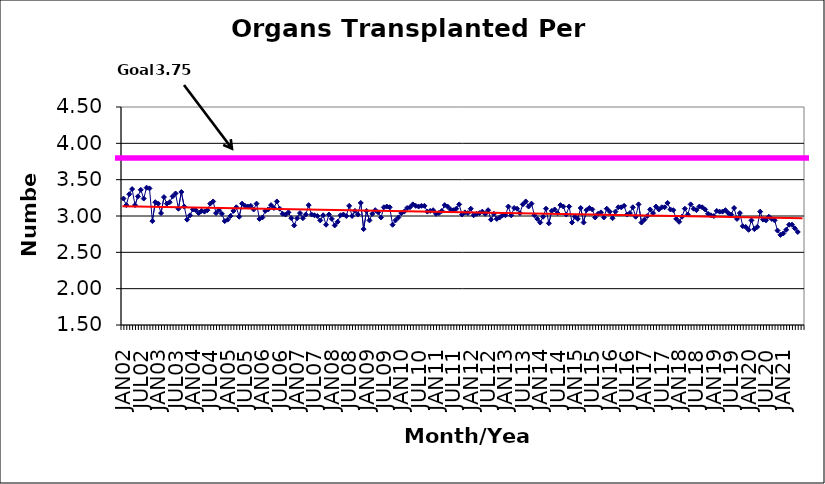
| Category | Series 0 |
|---|---|
| JAN02 | 3.24 |
| FEB02 | 3.15 |
| MAR02 | 3.3 |
| APR02 | 3.37 |
| MAY02 | 3.15 |
| JUN02 | 3.27 |
| JUL02 | 3.36 |
| AUG02 | 3.24 |
| SEP02 | 3.39 |
| OCT02 | 3.38 |
| NOV02 | 2.93 |
| DEC02 | 3.19 |
| JAN03 | 3.17 |
| FEB03 | 3.04 |
| MAR03 | 3.26 |
| APR03 | 3.17 |
| MAY03 | 3.19 |
| JUN03 | 3.27 |
| JUL03 | 3.31 |
| AUG03 | 3.1 |
| SEP03 | 3.33 |
| OCT03 | 3.13 |
| NOV03 | 2.95 |
| DEC03 | 3.01 |
| JAN04 | 3.09 |
| FEB04 | 3.08 |
| MAR04 | 3.04 |
| APR04 | 3.07 |
| MAY04 | 3.06 |
| JUN04 | 3.08 |
| JUL04 | 3.17 |
| AUG04 | 3.2 |
| SEP04 | 3.04 |
| OCT04 | 3.08 |
| NOV04 | 3.03 |
| DEC04 | 2.93 |
| JAN05 | 2.95 |
| FEB05 | 3 |
| MAR05 | 3.07 |
| APR05 | 3.12 |
| MAY05 | 2.99 |
| JUN05 | 3.17 |
| JUL05 | 3.14 |
| AUG05 | 3.13 |
| SEP05 | 3.14 |
| OCT05 | 3.09 |
| NOV05 | 3.17 |
| DEC05 | 2.96 |
| JAN06 | 2.98 |
| FEB06 | 3.07 |
| MAR06 | 3.09 |
| APR06 | 3.15 |
| MAY06 | 3.11 |
| JUN06 | 3.2 |
| JUL06 | 3.1 |
| AUG06 | 3.03 |
| SEP06 | 3.02 |
| OCT06 | 3.05 |
| NOV06 | 2.97 |
| DEC06 | 2.87 |
| JAN07 | 2.97 |
| FEB07 | 3.04 |
| MAR07 | 2.97 |
| APR07 | 3.02 |
| MAY07 | 3.15 |
| JUN07 | 3.02 |
| JUL07 | 3.01 |
| AUG07 | 3 |
| SEP07 | 2.94 |
| OCT07 | 3.01 |
| NOV07 | 2.88 |
| DEC07 | 3.02 |
| JAN08 | 2.96 |
| FEB08 | 2.87 |
| MAR08 | 2.92 |
| APR08 | 3.01 |
| MAY08 | 3.02 |
| JUN08 | 3 |
| JUL08 | 3.14 |
| AUG08 | 3 |
| SEP08 | 3.07 |
| OCT08 | 3.02 |
| NOV08 | 3.18 |
| DEC08 | 2.82 |
| JAN09 | 3.07 |
| FEB09 | 2.94 |
| MAR09 | 3.03 |
| APR09 | 3.08 |
| MAY09 | 3.05 |
| JUN09 | 2.98 |
| JUL09 | 3.12 |
| AUG09 | 3.13 |
| SEP09 | 3.12 |
| OCT09 | 2.88 |
| NOV09 | 2.94 |
| DEC09 | 2.98 |
| JAN10 | 3.04 |
| FEB10 | 3.06 |
| MAR10 | 3.11 |
| APR10 | 3.12 |
| MAY10 | 3.16 |
| JUN10 | 3.14 |
| JUL10 | 3.13 |
| AUG10 | 3.14 |
| SEP10 | 3.14 |
| OCT10 | 3.06 |
| NOV10 | 3.07 |
| DEC10 | 3.08 |
| JAN11 | 3.03 |
| FEB11 | 3.04 |
| MAR11 | 3.07 |
| APR11 | 3.15 |
| MAY11 | 3.13 |
| JUN11 | 3.09 |
| JUL11 | 3.08 |
| AUG11 | 3.1 |
| SEP11 | 3.16 |
| OCT11 | 3.02 |
| NOV11 | 3.05 |
| DEC11 | 3.04 |
| JAN12 | 3.1 |
| FEB12 | 3.01 |
| MAR12 | 3.03 |
| APR12 | 3.04 |
| MAY12 | 3.06 |
| JUN12 | 3.03 |
| JUL12 | 3.08 |
| AUG12 | 2.95 |
| SEP12 | 3.03 |
| OCT12 | 2.96 |
| NOV12 | 2.98 |
| DEC12 | 3.01 |
| JAN13 | 3.01 |
| FEB13 | 3.13 |
| MAR13 | 3.01 |
| APR13 | 3.11 |
| MAY13 | 3.1 |
| JUN13 | 3.04 |
| JUL13 | 3.16 |
| AUG13 | 3.2 |
| SEP13 | 3.13 |
| OCT13 | 3.17 |
| NOV13 | 3.01 |
| DEC13 | 2.96 |
| JAN14 | 2.91 |
| FEB14 | 2.99 |
| MAR14 | 3.1 |
| APR14 | 2.9 |
| MAY14 | 3.07 |
| JUN14 | 3.09 |
| JUL14 | 3.04 |
| AUG14 | 3.15 |
| SEP14 | 3.13 |
| OCT14 | 3.02 |
| NOV14 | 3.13 |
| DEC14 | 2.91 |
| JAN15 | 2.99 |
| FEB15 | 2.96 |
| MAR15 | 3.11 |
| APR15 | 2.91 |
| MAY15 | 3.08 |
| JUN15 | 3.11 |
| JUL15 | 3.09 |
| AUG15 | 2.98 |
| SEP15 | 3.03 |
| OCT15 | 3.05 |
| NOV15 | 2.98 |
| DEC15 | 3.1 |
| JAN16 | 3.06 |
| FEB16 | 2.97 |
| MAR16 | 3.06 |
| APR16 | 3.12 |
| MAY16 | 3.12 |
| JUN16 | 3.14 |
| JUL16 | 3.02 |
| AUG16 | 3.04 |
| SEP16 | 3.12 |
| OCT16 | 2.99 |
| NOV16 | 3.16 |
| DEC16 | 2.91 |
| JAN17 | 2.95 |
| FEB17 | 3 |
| MAR17 | 3.09 |
| APR17 | 3.04 |
| MAY17 | 3.13 |
| JUN17 | 3.09 |
| JUL17 | 3.12 |
| AUG17 | 3.12 |
| SEP17 | 3.18 |
| OCT17 | 3.09 |
| NOV17 | 3.08 |
| DEC17 | 2.96 |
| JAN18 | 2.92 |
| FEB18 | 2.99 |
| MAR18 | 3.1 |
| APR18 | 3.02 |
| MAY18 | 3.16 |
| JUN18 | 3.1 |
| JUL18 | 3.08 |
| AUG18 | 3.13 |
| SEP18 | 3.12 |
| OCT18 | 3.09 |
| NOV18 | 3.03 |
| DEC18 | 3.01 |
| JAN19 | 3 |
| FEB19 | 3.07 |
| MAR19 | 3.06 |
| APR19 | 3.06 |
| MAY19 | 3.08 |
| JUN19 | 3.04 |
| JUL19 | 3.02 |
| AUG19 | 3.11 |
| SEP19 | 2.96 |
| OCT19 | 3.04 |
| NOV19 | 2.86 |
| DEC19 | 2.85 |
| JAN20 | 2.81 |
| FEB20 | 2.94 |
| MAR20 | 2.82 |
| APR20 | 2.85 |
| MAY20 | 3.06 |
| JUN20 | 2.95 |
| JUL20 | 2.94 |
| AUG20 | 2.99 |
| SEP20 | 2.96 |
| OCT20 | 2.94 |
| NOV20 | 2.8 |
| DEC20 | 2.74 |
| JAN21 | 2.76 |
| FEB21 | 2.81 |
| MAR21 | 2.88 |
| APR21 | 2.88 |
| MAY21 | 2.83 |
| JUN21 | 2.78 |